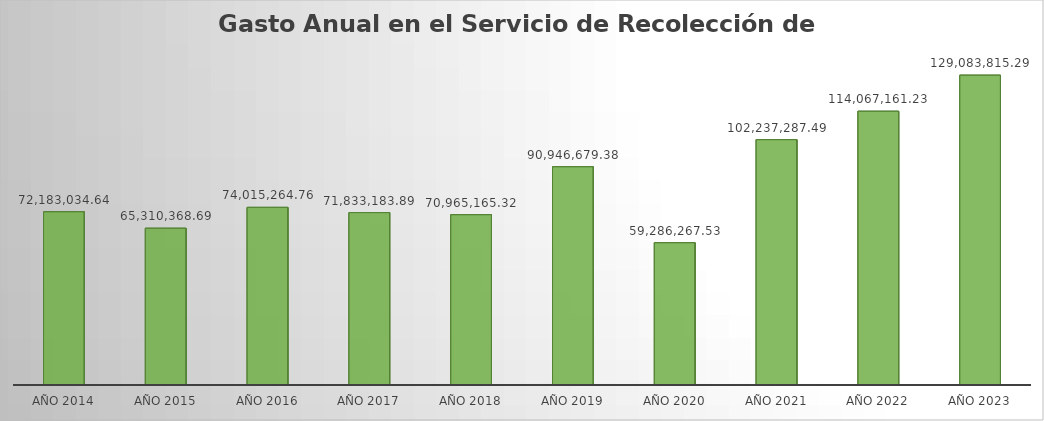
| Category | Monto |
|---|---|
| Año 2014 | 72183034.64 |
| Año 2015 | 65310368.69 |
| Año 2016 | 74015264.76 |
| Año 2017 | 71833183.89 |
| Año 2018 | 70965165.32 |
| Año 2019 | 90946679.38 |
| Año 2020 | 59286267.53 |
| Año 2021 | 102237287.49 |
| Año 2022 | 114067161.23 |
| Año 2023 | 129083815.29 |